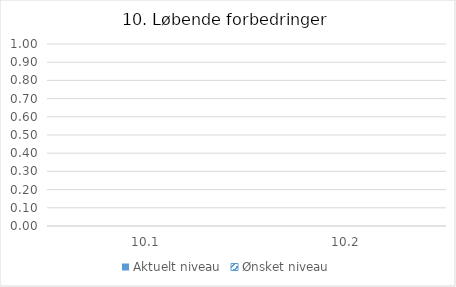
| Category | Aktuelt niveau | Ønsket niveau |
|---|---|---|
| 10.1 | 0 | 0 |
| 10.2 | 0 | 0 |